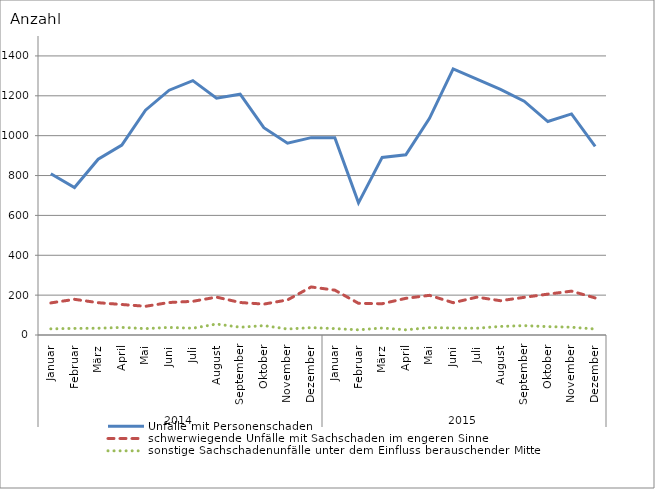
| Category | Unfälle mit Personenschaden | schwerwiegende Unfälle mit Sachschaden im engeren Sinne | sonstige Sachschadenunfälle unter dem Einfluss berauschender Mittel |
|---|---|---|---|
| 0 | 809 | 161 | 31 |
| 1 | 740 | 179 | 33 |
| 2 | 882 | 162 | 34 |
| 3 | 953 | 153 | 38 |
| 4 | 1128 | 144 | 32 |
| 5 | 1228 | 163 | 38 |
| 6 | 1276 | 169 | 34 |
| 7 | 1188 | 190 | 55 |
| 8 | 1208 | 163 | 39 |
| 9 | 1040 | 155 | 47 |
| 10 | 962 | 176 | 30 |
| 11 | 990 | 241 | 37 |
| 12 | 990 | 225 | 32 |
| 13 | 663 | 159 | 26 |
| 14 | 891 | 157 | 35 |
| 15 | 904 | 184 | 26 |
| 16 | 1087 | 199 | 37 |
| 17 | 1335 | 162 | 35 |
| 18 | 1284 | 190 | 34 |
| 19 | 1232 | 172 | 43 |
| 20 | 1173 | 189 | 47 |
| 21 | 1071 | 205 | 42 |
| 22 | 1109 | 220 | 39 |
| 23 | 946 | 186 | 30 |